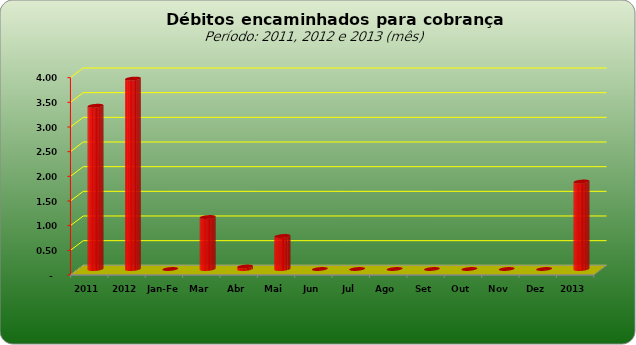
| Category |  3.309.443,02   3.859.728,44   -     1.053.903,71   50.529,60   669.296,13   -     -     -     -     -     -     -     1.773.729,44  |
|---|---|
| 2011 | 3309443.02 |
| 2012 | 3859728.44 |
| Jan-Fev | 0 |
| Mar | 1053903.71 |
| Abr | 50529.6 |
| Mai | 669296.13 |
| Jun | 0 |
| Jul | 0 |
| Ago | 0 |
| Set | 0 |
| Out | 0 |
| Nov | 0 |
| Dez | 0 |
| 2013 | 1773729.44 |